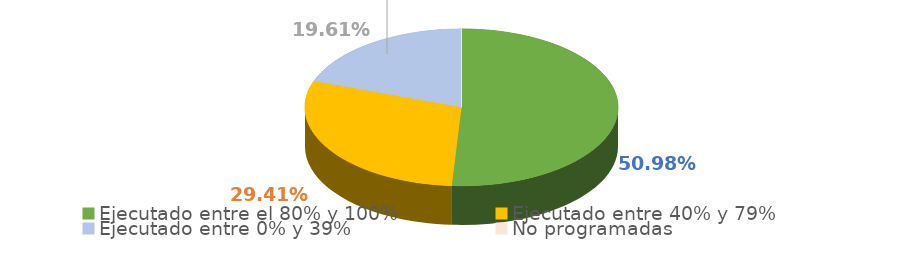
| Category | Series 0 |
|---|---|
| Ejecutado entre el 80% y 100% | 0.51 |
| Ejecutado entre 40% y 79% | 0.294 |
| Ejecutado entre 0% y 39% | 0.196 |
| No programadas | 0 |